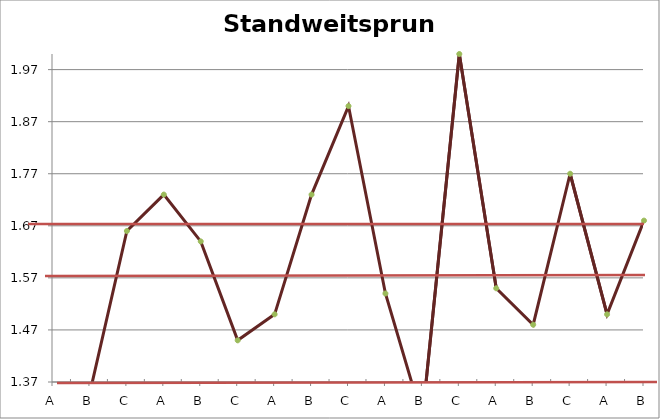
| Category | Standweitsprung |
|---|---|
| A | 1.25 |
| B | 1.35 |
| C | 1.66 |
| A | 1.73 |
| B | 1.64 |
| C | 1.45 |
| A | 1.5 |
| B | 1.73 |
| C | 1.9 |
| A | 1.54 |
| B | 1.3 |
| C | 2 |
| A | 1.55 |
| B | 1.48 |
| C | 1.77 |
| A | 1.5 |
| B | 1.68 |